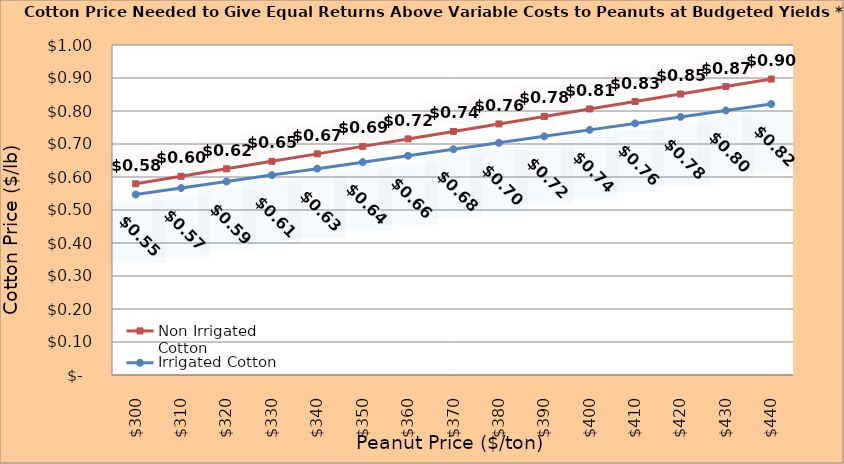
| Category | Non Irrigated Cotton | Irrigated Cotton |
|---|---|---|
| 299.8936170212766 | 0.579 | 0.547 |
| 309.8936170212766 | 0.602 | 0.567 |
| 319.8936170212766 | 0.625 | 0.586 |
| 329.8936170212766 | 0.647 | 0.606 |
| 339.8936170212766 | 0.67 | 0.625 |
| 349.8936170212766 | 0.693 | 0.645 |
| 359.8936170212766 | 0.715 | 0.664 |
| 369.8936170212766 | 0.738 | 0.684 |
| 379.8936170212766 | 0.761 | 0.704 |
| 389.8936170212766 | 0.783 | 0.723 |
| 399.8936170212766 | 0.806 | 0.743 |
| 409.8936170212766 | 0.829 | 0.762 |
| 419.8936170212766 | 0.851 | 0.782 |
| 429.8936170212766 | 0.874 | 0.802 |
| 439.8936170212766 | 0.897 | 0.821 |